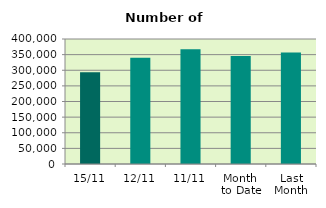
| Category | Series 0 |
|---|---|
| 15/11 | 293746 |
| 12/11 | 339756 |
| 11/11 | 366964 |
| Month 
to Date | 345967.273 |
| Last
Month | 357160.667 |